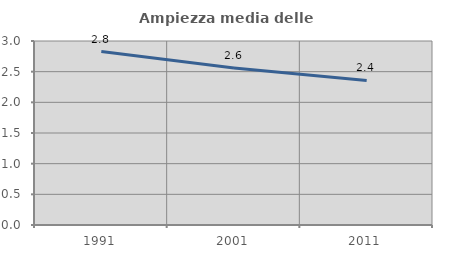
| Category | Ampiezza media delle famiglie |
|---|---|
| 1991.0 | 2.828 |
| 2001.0 | 2.561 |
| 2011.0 | 2.356 |